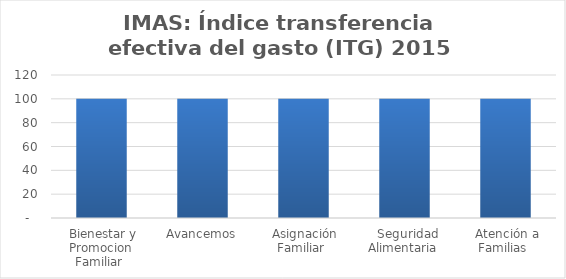
| Category | Índice transferencia efectiva del gasto (ITG) |
|---|---|
| Bienestar y Promocion Familiar | 100 |
| Avancemos | 100 |
| Asignación Familiar | 100 |
| Seguridad Alimentaria | 100 |
| Atención a Familias | 100 |